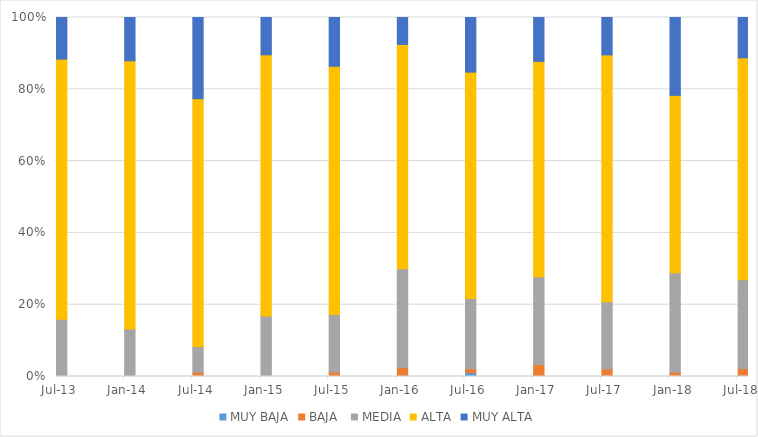
| Category | MUY BAJA | BAJA  | MEDIA | ALTA | MUY ALTA |
|---|---|---|---|---|---|
| 2013-07-01 | 0 | 0 | 0.157 | 0.714 | 0.114 |
| 2014-01-01 | 0 | 0 | 0.133 | 0.747 | 0.12 |
| 2014-07-01 | 0 | 0.012 | 0.071 | 0.69 | 0.226 |
| 2015-01-01 | 0 | 0 | 0.169 | 0.727 | 0.104 |
| 2015-07-01 | 0 | 0.012 | 0.16 | 0.691 | 0.136 |
| 2016-01-01 | 0 | 0.025 | 0.275 | 0.625 | 0.075 |
| 2016-07-01 | 0.011 | 0.011 | 0.196 | 0.63 | 0.152 |
| 2017-01-01 | 0 | 0.033 | 0.244 | 0.6 | 0.122 |
| 2017-07-01 | 0 | 0.021 | 0.188 | 0.688 | 0.104 |
| 2018-01-01 | 0 | 0.012 | 0.277 | 0.494 | 0.217 |
| 2018-07-01 | 0 | 0.022 | 0.247 | 0.618 | 0.112 |